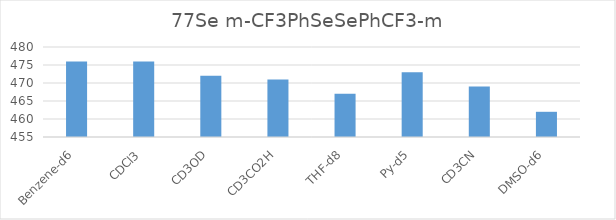
| Category | 77Se CS |
|---|---|
| Benzene-d6 | 476 |
| CDCl3 | 476 |
| CD3OD | 472 |
| CD3CO2H | 471 |
| THF-d8 | 467 |
| Py-d5 | 473 |
| CD3CN | 469 |
| DMSO-d6 | 462 |